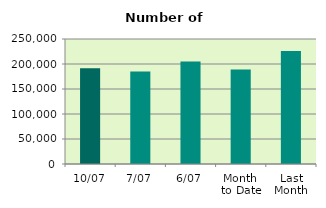
| Category | Series 0 |
|---|---|
| 10/07 | 191534 |
| 7/07 | 185202 |
| 6/07 | 205148 |
| Month 
to Date | 189072.667 |
| Last
Month | 226069.545 |